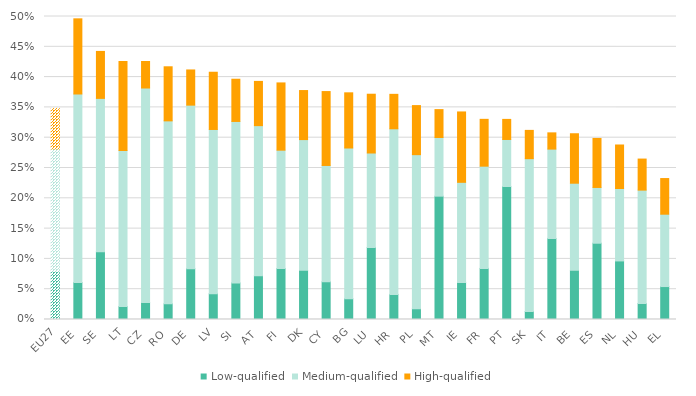
| Category | Low-qualified | Medium-qualified | High-qualified |
|---|---|---|---|
| EU27 | 0.08 | 0.202 | 0.067 |
| EE | 0.061 | 0.311 | 0.124 |
| SE | 0.112 | 0.253 | 0.077 |
| LT | 0.021 | 0.258 | 0.147 |
| CZ | 0.028 | 0.354 | 0.044 |
| RO | 0.026 | 0.302 | 0.089 |
| DE | 0.084 | 0.27 | 0.058 |
| LV | 0.043 | 0.271 | 0.094 |
| SI | 0.06 | 0.266 | 0.07 |
| AT | 0.072 | 0.248 | 0.073 |
| FI | 0.084 | 0.195 | 0.111 |
| DK | 0.081 | 0.216 | 0.081 |
| CY | 0.062 | 0.192 | 0.122 |
| BG | 0.034 | 0.249 | 0.091 |
| LU | 0.119 | 0.156 | 0.097 |
| HR | 0.041 | 0.273 | 0.057 |
| PL | 0.018 | 0.254 | 0.081 |
| MT | 0.204 | 0.097 | 0.046 |
| IE | 0.061 | 0.165 | 0.116 |
| FR | 0.084 | 0.169 | 0.077 |
| PT | 0.219 | 0.078 | 0.033 |
| SK | 0.013 | 0.252 | 0.047 |
| IT | 0.134 | 0.147 | 0.027 |
| BE | 0.081 | 0.144 | 0.082 |
| ES | 0.126 | 0.092 | 0.081 |
| NL | 0.097 | 0.12 | 0.072 |
| HU | 0.026 | 0.187 | 0.051 |
| EL | 0.054 | 0.119 | 0.059 |